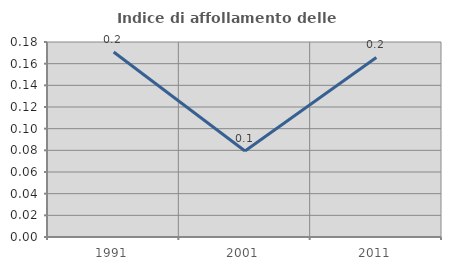
| Category | Indice di affollamento delle abitazioni  |
|---|---|
| 1991.0 | 0.171 |
| 2001.0 | 0.079 |
| 2011.0 | 0.166 |